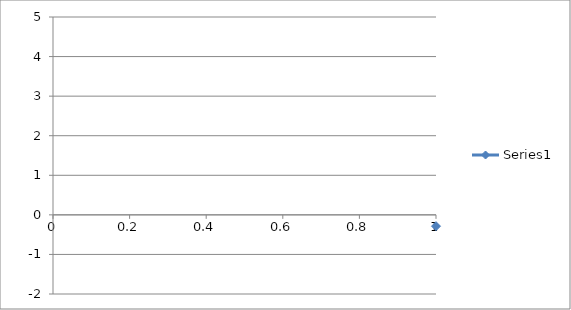
| Category | Series 0 |
|---|---|
| 0 | -0.286 |
| 1 | -0.252 |
| 2 | -0.234 |
| 3 | -0.238 |
| 4 | -0.235 |
| 5 | -0.243 |
| 6 | -0.266 |
| 7 | -0.305 |
| 8 | -0.318 |
| 9 | -0.336 |
| 10 | -0.356 |
| 11 | -0.347 |
| 12 | -0.368 |
| 13 | -0.382 |
| 14 | -0.426 |
| 15 | -0.457 |
| 16 | -0.487 |
| 17 | -0.518 |
| 18 | -0.546 |
| 19 | -0.592 |
| 20 | -0.63 |
| 21 | -0.667 |
| 22 | -0.718 |
| 23 | -0.775 |
| 24 | -0.807 |
| 25 | -0.868 |
| 26 | -0.897 |
| 27 | -0.947 |
| 28 | -0.999 |
| 29 | -1.027 |
| 30 | -1.065 |
| 31 | -1.084 |
| 32 | -1.099 |
| 33 | -1.103 |
| 34 | -1.094 |
| 35 | -1.082 |
| 36 | -1.075 |
| 37 | -1.048 |
| 38 | -1.009 |
| 39 | -0.962 |
| 40 | -0.918 |
| 41 | -0.862 |
| 42 | -0.806 |
| 43 | -0.726 |
| 44 | -0.612 |
| 45 | -0.511 |
| 46 | -0.36 |
| 47 | -0.206 |
| 48 | -0.004 |
| 49 | 0.186 |
| 50 | 0.374 |
| 51 | 0.628 |
| 52 | 0.849 |
| 53 | 1.069 |
| 54 | 1.353 |
| 55 | 1.578 |
| 56 | 1.888 |
| 57 | 2.128 |
| 58 | 2.351 |
| 59 | 2.619 |
| 60 | 2.826 |
| 61 | 3.063 |
| 62 | 3.241 |
| 63 | 3.385 |
| 64 | 3.554 |
| 65 | 3.683 |
| 66 | 3.784 |
| 67 | 3.901 |
| 68 | 3.971 |
| 69 | 4.03 |
| 70 | 4.073 |
| 71 | 4.096 |
| 72 | 4.127 |
| 73 | 4.132 |
| 74 | 4.131 |
| 75 | 4.116 |
| 76 | 4.063 |
| 77 | 4.016 |
| 78 | 3.987 |
| 79 | 3.94 |
| 80 | 3.878 |
| 81 | 3.835 |
| 82 | 3.795 |
| 83 | 3.758 |
| 84 | 3.715 |
| 85 | 3.671 |
| 86 | 3.639 |
| 87 | 3.582 |
| 88 | 3.55 |
| 89 | 3.5 |
| 90 | 3.447 |
| 91 | 3.385 |
| 92 | 3.33 |
| 93 | 3.265 |
| 94 | 3.179 |
| 95 | 3.093 |
| 96 | 3.004 |
| 97 | 2.885 |
| 98 | 2.732 |
| 99 | 2.58 |
| 100 | 2.421 |
| 101 | 2.262 |
| 102 | 2.065 |
| 103 | 1.853 |
| 104 | 1.67 |
| 105 | 1.477 |
| 106 | 1.224 |
| 107 | 1.023 |
| 108 | 0.75 |
| 109 | 0.573 |
| 110 | 0.369 |
| 111 | 0.16 |
| 112 | 0.001 |
| 113 | -0.192 |
| 114 | -0.331 |
| 115 | -0.463 |
| 116 | -0.605 |
| 117 | -0.702 |
| 118 | -0.807 |
| 119 | -0.885 |
| 120 | -0.923 |
| 121 | -0.955 |
| 122 | -0.996 |
| 123 | -1.032 |
| 124 | -1.051 |
| 125 | -1.051 |
| 126 | -1.073 |
| 127 | -1.052 |
| 128 | -1.065 |
| 129 | -1.075 |
| 130 | -1.068 |
| 131 | -1.043 |
| 132 | -0.98 |
| 133 | -0.924 |
| 134 | -0.851 |
| 135 | -0.778 |
| 136 | -0.734 |
| 137 | -0.674 |
| 138 | -0.618 |
| 139 | -0.567 |
| 140 | -0.523 |
| 141 | -0.472 |
| 142 | -0.427 |
| 143 | -0.402 |
| 144 | -0.35 |
| 145 | -0.314 |
| 146 | -0.272 |
| 147 | -0.233 |
| 148 | -0.191 |
| 149 | -0.151 |
| 150 | -0.136 |
| 151 | -0.102 |
| 152 | -0.073 |
| 153 | -0.063 |
| 154 | -0.059 |
| 155 | -0.054 |
| 156 | -0.023 |
| 157 | -0.009 |
| 158 | 0.028 |
| 159 | 0.04 |
| 160 | 0.038 |